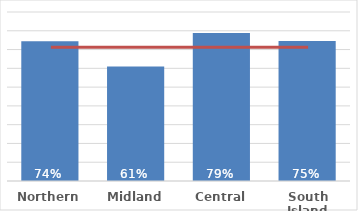
| Category | Māori |
|---|---|
| Northern | 0.745 |
| Midland | 0.61 |
| Central | 0.788 |
| South Island | 0.746 |